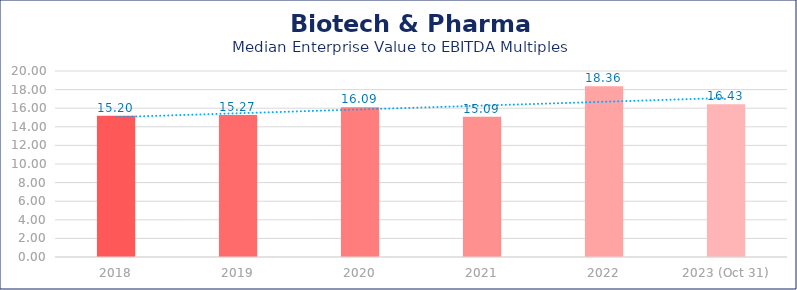
| Category | Biotech & Pharma |
|---|---|
| 2018 | 15.2 |
| 2019 | 15.27 |
| 2020 | 16.09 |
| 2021 | 15.09 |
| 2022 | 18.36 |
| 2023 (Oct 31) | 16.43 |